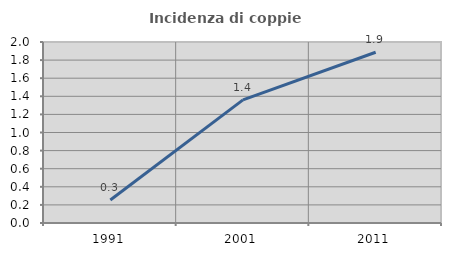
| Category | Incidenza di coppie miste |
|---|---|
| 1991.0 | 0.254 |
| 2001.0 | 1.36 |
| 2011.0 | 1.886 |